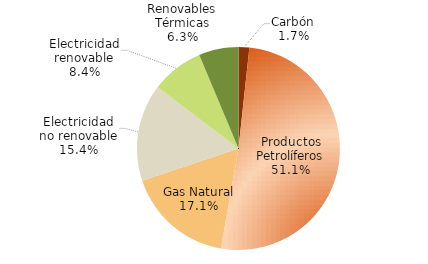
| Category | Series 0 |
|---|---|
| Carbón | 1442.697 |
| Productos Petrolíferos | 42879.042 |
| Gas Natural | 14344.252 |
| Electricidad no renovable | 12967.234 |
| Electricidad renovable | 7031.371 |
| Renovables Térmicas | 5301.931 |